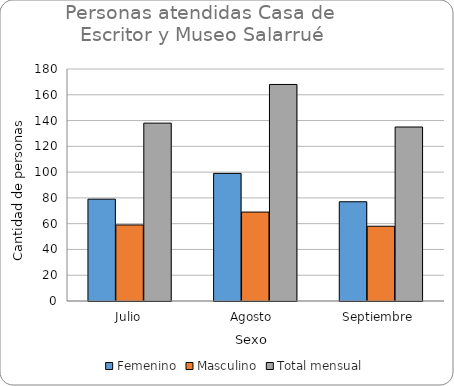
| Category | Femenino | Masculino | Total mensual  |
|---|---|---|---|
| Julio | 79 | 59 | 138 |
| Agosto  | 99 | 69 | 168 |
| Septiembre  | 77 | 58 | 135 |